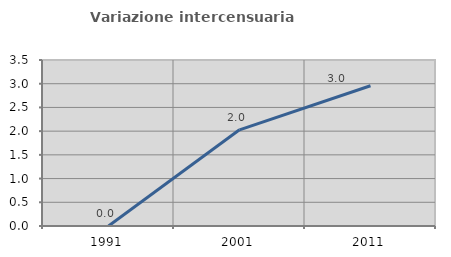
| Category | Variazione intercensuaria annua |
|---|---|
| 1991.0 | 0 |
| 2001.0 | 2.028 |
| 2011.0 | 2.956 |